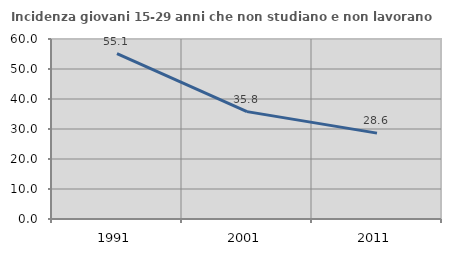
| Category | Incidenza giovani 15-29 anni che non studiano e non lavorano  |
|---|---|
| 1991.0 | 55.114 |
| 2001.0 | 35.787 |
| 2011.0 | 28.628 |